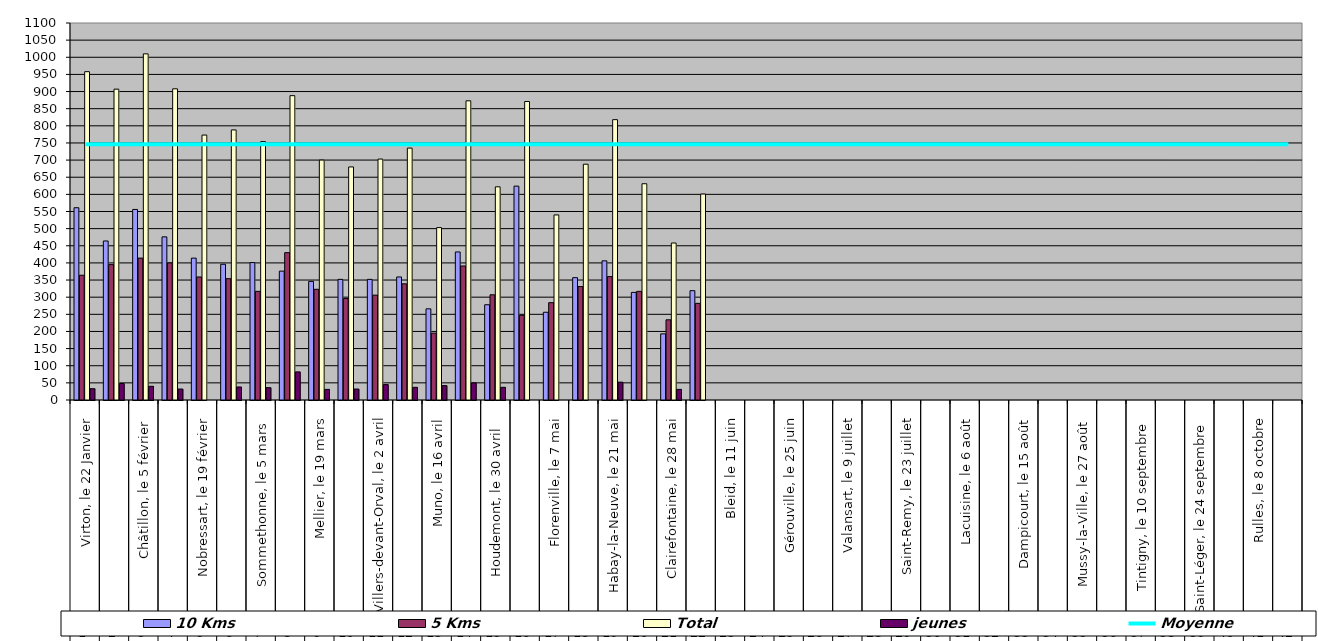
| Category | 10 Kms | 5 Kms | Total | jeunes |
|---|---|---|---|---|
| 0 | 561 | 364 | 958 | 33 |
| 1 | 464 | 395 | 907 | 48 |
| 2 | 556 | 414 | 1010 | 40 |
| 3 | 476 | 400 | 908 | 32 |
| 4 | 414 | 359 | 773 | 0 |
| 5 | 396 | 354 | 788 | 38 |
| 6 | 401 | 317 | 754 | 36 |
| 7 | 376 | 430 | 888 | 82 |
| 8 | 346 | 323 | 700 | 31 |
| 9 | 352 | 296 | 680 | 32 |
| 10 | 352 | 306 | 703 | 45 |
| 11 | 359 | 339 | 735 | 37 |
| 12 | 266 | 195 | 503 | 42 |
| 13 | 432 | 391 | 873 | 50 |
| 14 | 278 | 307 | 622 | 37 |
| 15 | 624 | 247 | 871 | 0 |
| 16 | 256 | 284 | 540 | 0 |
| 17 | 357 | 331 | 688 | 0 |
| 18 | 406 | 360 | 818 | 52 |
| 19 | 314 | 317 | 631 | 0 |
| 20 | 193 | 234 | 458 | 31 |
| 21 | 319 | 282 | 601 | 0 |
| 22 | 0 | 0 | 0 | 0 |
| 23 | 0 | 0 | 0 | 0 |
| 24 | 0 | 0 | 0 | 0 |
| 25 | 0 | 0 | 0 | 0 |
| 26 | 0 | 0 | 0 | 0 |
| 27 | 0 | 0 | 0 | 0 |
| 28 | 0 | 0 | 0 | 0 |
| 29 | 0 | 0 | 0 | 0 |
| 30 | 0 | 0 | 0 | 0 |
| 31 | 0 | 0 | 0 | 0 |
| 32 | 0 | 0 | 0 | 0 |
| 33 | 0 | 0 | 0 | 0 |
| 34 | 0 | 0 | 0 | 0 |
| 35 | 0 | 0 | 0 | 0 |
| 36 | 0 | 0 | 0 | 0 |
| 37 | 0 | 0 | 0 | 0 |
| 38 | 0 | 0 | 0 | 0 |
| 39 | 0 | 0 | 0 | 0 |
| 40 | 0 | 0 | 0 | 0 |
| 41 | 0 | 0 | 0 | 0 |